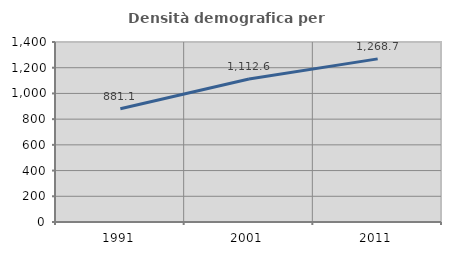
| Category | Densità demografica |
|---|---|
| 1991.0 | 881.085 |
| 2001.0 | 1112.555 |
| 2011.0 | 1268.729 |